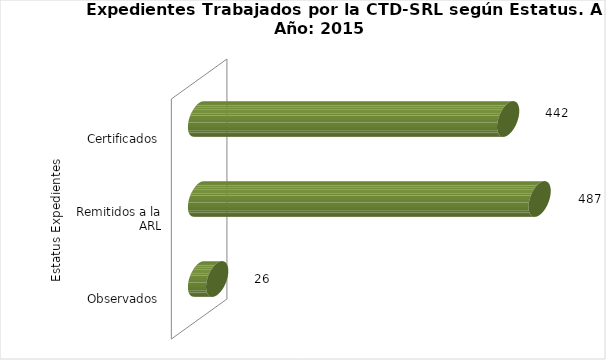
| Category | Total |
|---|---|
| 0 | 26 |
| 1 | 487 |
| 2 | 442 |